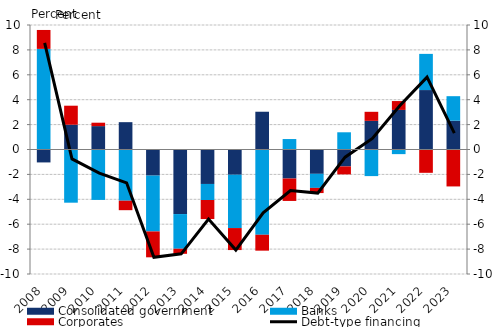
| Category | Consolidated government | Banks | Corporates |
|---|---|---|---|
| 2008.0 | -1.039 | 8.081 | 1.52 |
| 2009.0 | 1.991 | -4.272 | 1.527 |
| 2010.0 | 1.878 | -4.05 | 0.275 |
| 2011.0 | 2.195 | -4.111 | -0.763 |
| 2012.0 | -2.096 | -4.484 | -2.08 |
| 2013.0 | -5.186 | -2.785 | -0.407 |
| 2014.0 | -2.768 | -1.289 | -1.529 |
| 2015.0 | -2.027 | -4.284 | -1.766 |
| 2016.0 | 3.033 | -6.848 | -1.277 |
| 2017.0 | -2.331 | 0.84 | -1.801 |
| 2018.0 | -1.954 | -1.129 | -0.417 |
| 2019.0 | -1.357 | 1.383 | -0.642 |
| 2020.0 | 2.3 | -2.137 | 0.727 |
| 2021.0 | 3.179 | -0.372 | 0.712 |
| 2022.0 | 4.775 | 2.906 | -1.873 |
| 2023.0 | 2.315 | 1.967 | -2.967 |